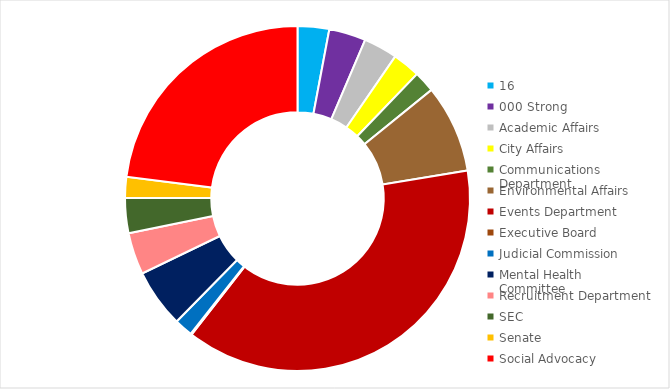
| Category | 2018-2019 |
|---|---|
| 16,000 Strong | 1793.29 |
| Academic Affairs | 2091.53 |
| City Affairs | 1924.89 |
| Communications Department | 1562.46 |
| Environmental Affairs | 1197.88 |
| Events Department | 4994.82 |
| Executive Board | 23078.65 |
| Judicial Commission | 64.95 |
| Mental Health Committee | 1045.56 |
| Recruitment Department | 3315.39 |
| SEC | 2377.85 |
| Senate | 2002.68 |
| Social Advocacy | 1175.81 |
| VP of Internal Affairs | 13913.31 |